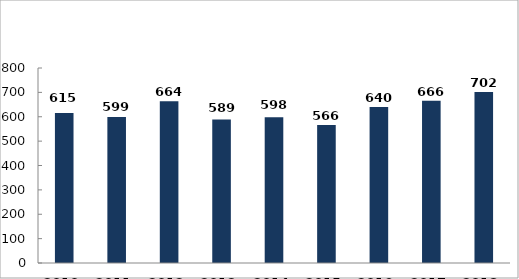
| Category | Biztonsági intézkedések száma |
|---|---|
| 2010. év | 615 |
| 2011. év | 599 |
| 2012. év | 664 |
| 2013. év | 589 |
| 2014. év | 598 |
| 2015. év | 566 |
| 2016. év | 640 |
| 2017. év | 666 |
| 2018. év | 702 |